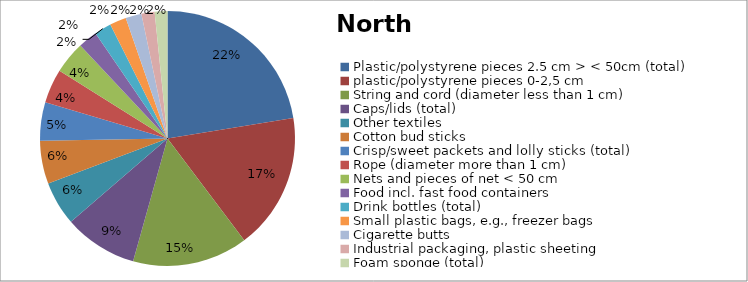
| Category | Series 0 |
|---|---|
| Plastic/polystyrene pieces 2.5 cm > < 50cm (total) | 0.179 |
| plastic/polystyrene pieces 0-2,5 cm | 0.138 |
| String and cord (diameter less than 1 cm) | 0.117 |
| Caps/lids (total) | 0.074 |
| Other textiles | 0.045 |
| Cotton bud sticks | 0.044 |
| Crisp/sweet packets and lolly sticks (total) | 0.039 |
| Rope (diameter more than 1 cm) | 0.034 |
| Nets and pieces of net < 50 cm | 0.033 |
| Food incl. fast food containers | 0.019 |
| Drink bottles (total) | 0.017 |
| Small plastic bags, e.g., freezer bags | 0.017 |
| Cigarette butts | 0.016 |
| Industrial packaging, plastic sheeting | 0.013 |
| Foam sponge (total) | 0.013 |